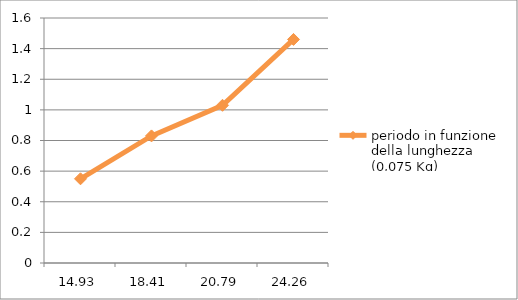
| Category | periodo in funzione della lunghezza (0,075 Kg) |
|---|---|
| 14.93 | 0.55 |
| 18.41 | 0.83 |
| 20.79 | 1.03 |
| 24.26 | 1.46 |